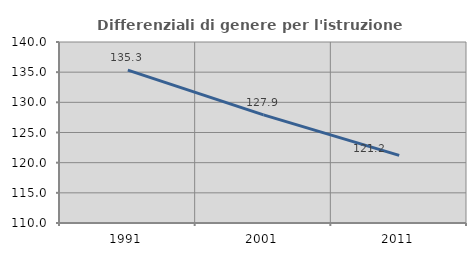
| Category | Differenziali di genere per l'istruzione superiore |
|---|---|
| 1991.0 | 135.339 |
| 2001.0 | 127.923 |
| 2011.0 | 121.208 |